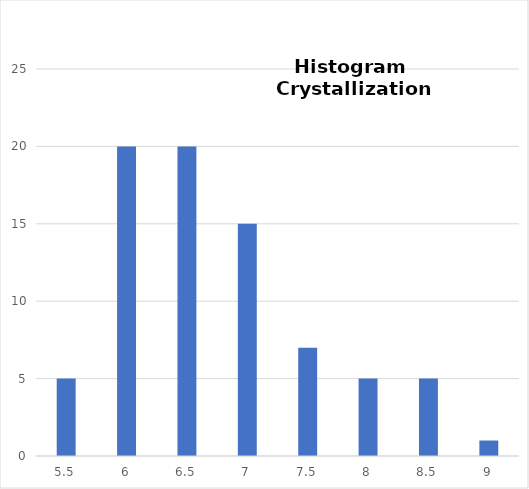
| Category | Series 0 |
|---|---|
| 5.5 | 5 |
| 6.0 | 20 |
| 6.5 | 20 |
| 7.0 | 15 |
| 7.5 | 7 |
| 8.0 | 5 |
| 8.5 | 5 |
| 9.0 | 1 |